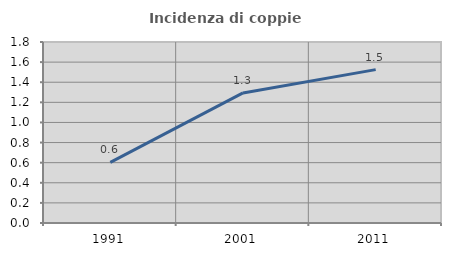
| Category | Incidenza di coppie miste |
|---|---|
| 1991.0 | 0.602 |
| 2001.0 | 1.293 |
| 2011.0 | 1.525 |